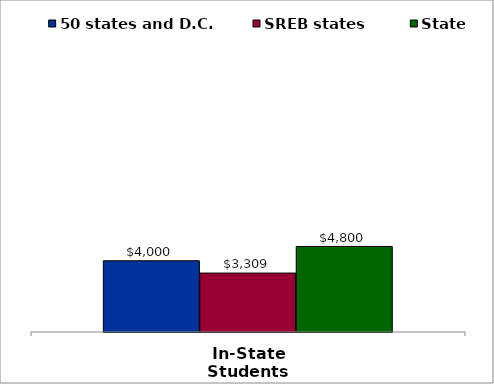
| Category | 50 states and D.C. | SREB states | State |
|---|---|---|---|
| In-State Students | 4000 | 3309 | 4800 |